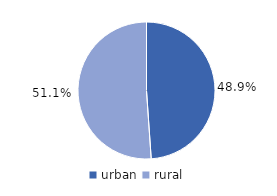
| Category | Series 0 |
|---|---|
| urban  | 48.9 |
| rural | 51.1 |